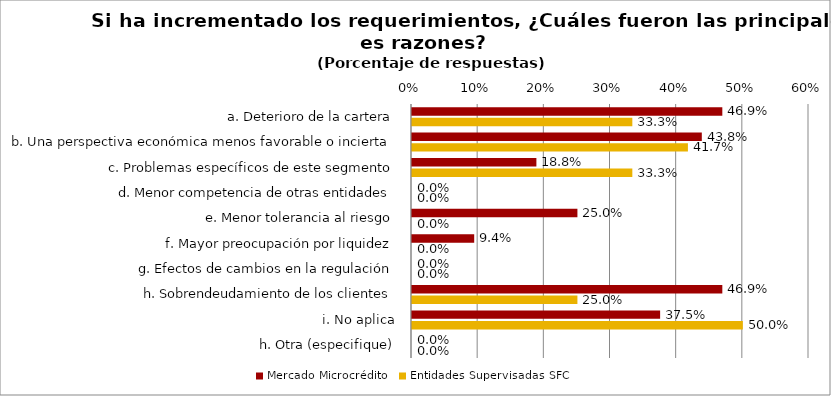
| Category | Mercado Microcrédito | Entidades Supervisadas SFC |
|---|---|---|
| a. Deterioro de la cartera | 0.469 | 0.333 |
| b. Una perspectiva económica menos favorable o incierta | 0.438 | 0.417 |
| c. Problemas específicos de este segmento | 0.188 | 0.333 |
| d. Menor competencia de otras entidades | 0 | 0 |
| e. Menor tolerancia al riesgo | 0.25 | 0 |
| f. Mayor preocupación por liquidez | 0.094 | 0 |
| g. Efectos de cambios en la regulación | 0 | 0 |
| h. Sobrendeudamiento de los clientes | 0.469 | 0.25 |
| i. No aplica | 0.375 | 0.5 |
| h. Otra (especifique) | 0 | 0 |